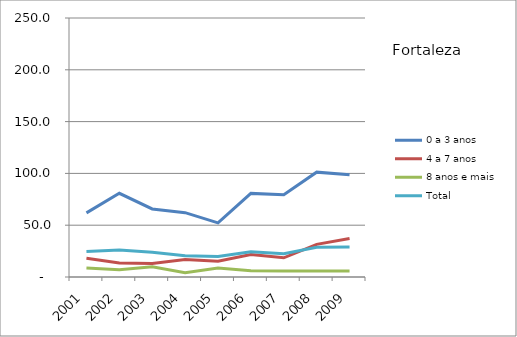
| Category | 0 a 3 anos | 4 a 7 anos | 8 anos e mais | Total |
|---|---|---|---|---|
| 2001.0 | 61.9 | 18 | 8.7 | 24.7 |
| 2002.0 | 80.8 | 13.6 | 6.9 | 26.1 |
| 2003.0 | 65.7 | 13.1 | 9.9 | 23.8 |
| 2004.0 | 62.1 | 16.9 | 4.2 | 20.5 |
| 2005.0 | 52.2 | 15.2 | 8.6 | 19.7 |
| 2006.0 | 80.7 | 21.8 | 6.1 | 24.3 |
| 2007.0 | 79.5 | 18.5 | 5.7 | 22.5 |
| 2008.0 | 101.2 | 31.5 | 5.9 | 28.8 |
| 2009.0 | 98.6 | 37.1 | 5.8 | 29 |